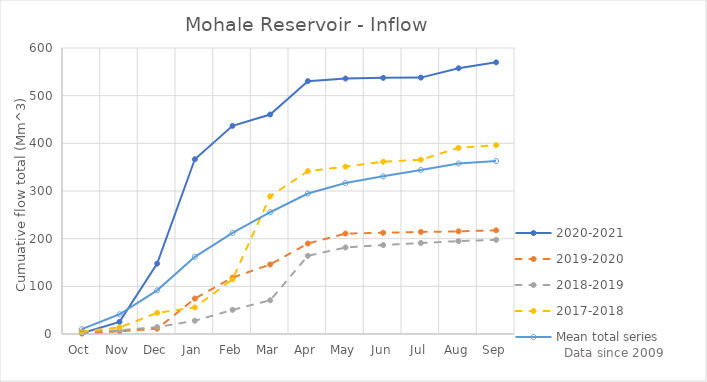
| Category | 2020-2021 | 2019-2020 | 2018-2019 | 2017-2018 | Mean total series |
|---|---|---|---|---|---|
| Oct | 1.621 | 0.951 | 4.329 | 5.326 | 10.217 |
| Nov | 25.455 | 5.634 | 7.809 | 13.803 | 41.338 |
| Dec | 147.681 | 10.998 | 14.555 | 44.303 | 91.598 |
| Jan | 366.642 | 74.282 | 27.745 | 55.803 | 161.975 |
| Feb | 436.625 | 118.307 | 50.593 | 114.524 | 211.981 |
| Mar | 460.494 | 145.801 | 70.717 | 288.895 | 255.443 |
| Apr | 530.477 | 189.827 | 163.992 | 341.523 | 294.627 |
| May | 535.936 | 210.69 | 181.539 | 351.174 | 316.641 |
| Jun | 537.354 | 212.341 | 186.744 | 361.388 | 330.757 |
| Jul | 537.893 | 214.117 | 190.88 | 365.649 | 344.139 |
| Aug | 557.47 | 215.324 | 194.81 | 390.495 | 357.658 |
| Sep | 569.911 | 217.552 | 197.512 | 396.183 | 362.85 |